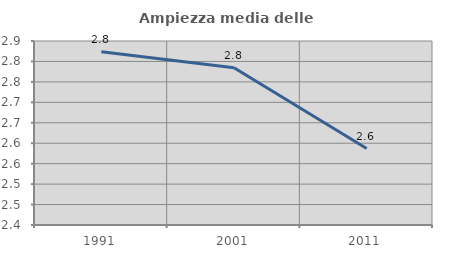
| Category | Ampiezza media delle famiglie |
|---|---|
| 1991.0 | 2.824 |
| 2001.0 | 2.784 |
| 2011.0 | 2.587 |